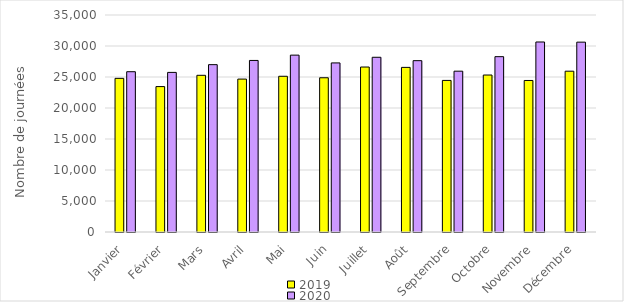
| Category | 2019 | 2020 |
|---|---|---|
| Janvier | 24783 | 25854 |
| Février | 23455 | 25743 |
| Mars | 25274 | 26992 |
| Avril | 24663 | 27670 |
| Mai | 25117 | 28528 |
| Juin | 24877 | 27273 |
| Juillet | 26609 | 28182 |
| Août | 26550 | 27636 |
| Septembre | 24449 | 25938 |
| Octobre | 25319 | 28281 |
| Novembre | 24440 | 30647 |
| Décembre | 25937 | 30621 |